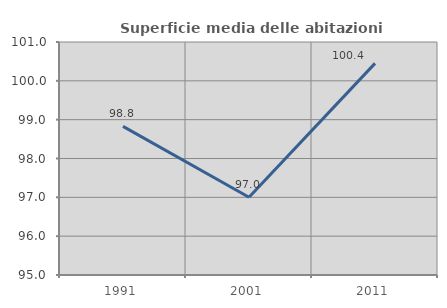
| Category | Superficie media delle abitazioni occupate |
|---|---|
| 1991.0 | 98.828 |
| 2001.0 | 97.001 |
| 2011.0 | 100.45 |